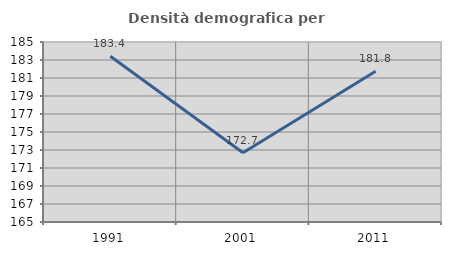
| Category | Densità demografica |
|---|---|
| 1991.0 | 183.411 |
| 2001.0 | 172.702 |
| 2011.0 | 181.756 |